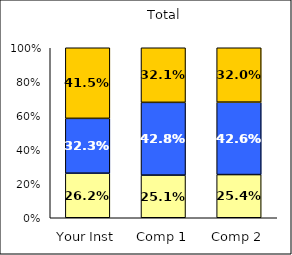
| Category | Low Social Self-Concept | Average Social Self-Concept | High Social Self-Concept |
|---|---|---|---|
| Your Inst | 0.262 | 0.323 | 0.415 |
| Comp 1 | 0.251 | 0.428 | 0.321 |
| Comp 2 | 0.254 | 0.426 | 0.32 |